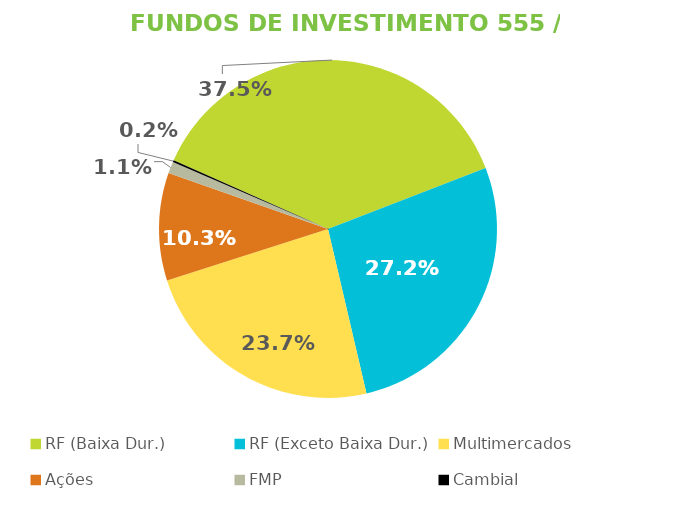
| Category | Fundos de Investimento 555 / FMP |
|---|---|
| RF (Baixa Dur.) | 0.375 |
| RF (Exceto Baixa Dur.) | 0.272 |
| Multimercados | 0.237 |
| Ações | 0.103 |
| FMP | 0.011 |
| Cambial | 0.002 |